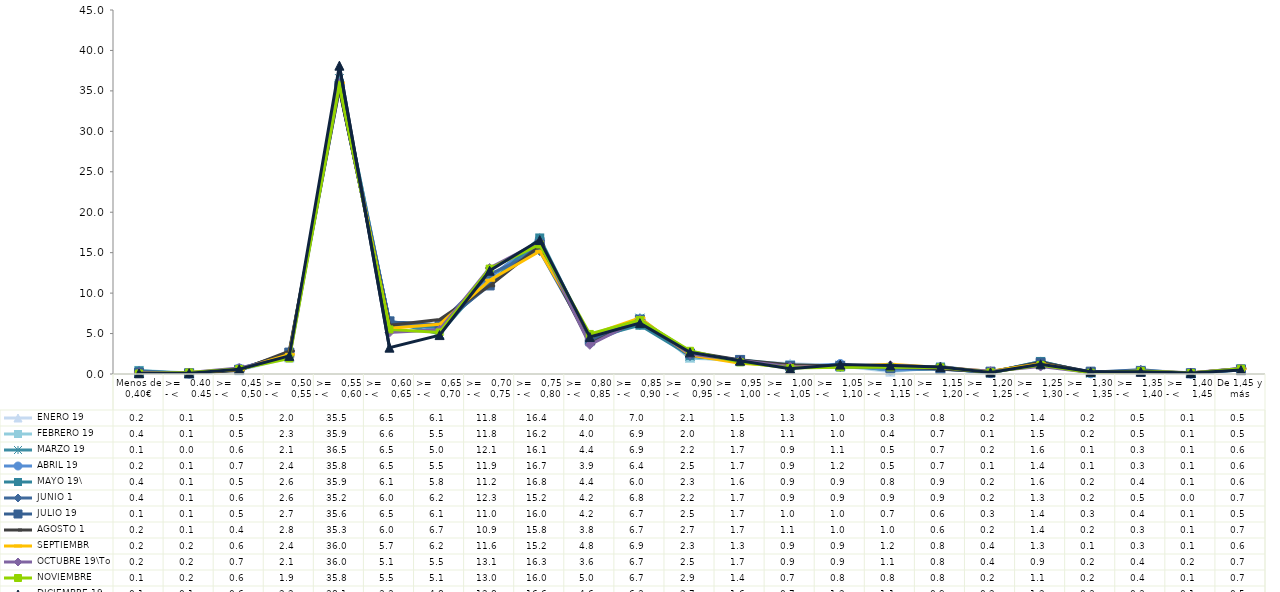
| Category |  ENERO 19 |  FEBRERO 19 |  MARZO 19 |  ABRIL 19 |  MAYO 19\ |  JUNIO 1 |  JULIO 19 |  AGOSTO 1 |  SEPTIEMBR |  OCTUBRE 19\To |  NOVIEMBRE  |  DICIEMBRE 19 |
|---|---|---|---|---|---|---|---|---|---|---|---|---|
| Menos de 0,40€ | 0.2 | 0.44 | 0.13 | 0.18 | 0.39 | 0.35 | 0.14 | 0.16 | 0.2 | 0.15 | 0.06 | 0.09 |
| >=   0.40 - <    0.45 | 0.08 | 0.12 | 0.03 | 0.06 | 0.05 | 0.07 | 0.09 | 0.11 | 0.18 | 0.18 | 0.19 | 0.1 |
| >=   0,45 - <    0,50 | 0.46 | 0.52 | 0.56 | 0.68 | 0.52 | 0.6 | 0.53 | 0.44 | 0.56 | 0.74 | 0.61 | 0.59 |
| >=   0,50 - <    0,55 | 2 | 2.28 | 2.09 | 2.36 | 2.64 | 2.57 | 2.65 | 2.84 | 2.43 | 2.07 | 1.92 | 2.24 |
| >=   0,55 - <    0,60 | 35.5 | 35.91 | 36.53 | 35.75 | 35.85 | 35.24 | 35.64 | 35.29 | 35.98 | 35.96 | 35.76 | 38.12 |
| >=   0,60 - <    0,65 | 6.48 | 6.55 | 6.45 | 6.51 | 6.08 | 6.02 | 6.5 | 6.02 | 5.65 | 5.13 | 5.51 | 3.26 |
| >=   0,65 - <   0,70 | 6.09 | 5.48 | 4.96 | 5.48 | 5.82 | 6.17 | 6.06 | 6.73 | 6.15 | 5.47 | 5.14 | 4.81 |
| >=   0,70 - <   0,75 | 11.8 | 11.8 | 12.07 | 11.94 | 11.15 | 12.34 | 10.95 | 10.9 | 11.59 | 13.1 | 13.03 | 12.77 |
| >=   0,75 - <   0,80 | 16.37 | 16.24 | 16.05 | 16.66 | 16.82 | 15.2 | 16.01 | 15.81 | 15.17 | 16.34 | 16.01 | 16.56 |
| >=   0,80 - <   0,85 | 4.02 | 4.03 | 4.37 | 3.89 | 4.39 | 4.15 | 4.17 | 3.76 | 4.8 | 3.61 | 4.95 | 4.57 |
| >=   0,85 - <   0,90 | 6.98 | 6.85 | 6.9 | 6.39 | 6.03 | 6.8 | 6.7 | 6.69 | 6.93 | 6.74 | 6.67 | 6.29 |
| >=   0,90 - <    0,95 | 2.1 | 1.96 | 2.19 | 2.54 | 2.29 | 2.23 | 2.54 | 2.74 | 2.34 | 2.48 | 2.87 | 2.68 |
| >=   0,95 - <   1,00 | 1.54 | 1.76 | 1.7 | 1.69 | 1.55 | 1.73 | 1.74 | 1.72 | 1.32 | 1.66 | 1.44 | 1.64 |
| >=   1,00 - <   1,05 | 1.31 | 1.14 | 0.93 | 0.88 | 0.85 | 0.89 | 1.01 | 1.13 | 0.93 | 0.9 | 0.73 | 0.66 |
| >=   1,05 - <    1,10 | 1.02 | 1.01 | 1.08 | 1.24 | 0.86 | 0.89 | 1 | 0.99 | 0.9 | 0.91 | 0.83 | 1.16 |
| >=   1,10 - <   1,15 | 0.29 | 0.42 | 0.48 | 0.46 | 0.78 | 0.9 | 0.73 | 1 | 1.19 | 1.09 | 0.83 | 1.05 |
| >=   1,15 - <    1,20 | 0.79 | 0.71 | 0.66 | 0.73 | 0.86 | 0.93 | 0.6 | 0.63 | 0.79 | 0.81 | 0.81 | 0.86 |
| >=   1,20 - <    1,25 | 0.2 | 0.12 | 0.19 | 0.11 | 0.21 | 0.2 | 0.29 | 0.24 | 0.35 | 0.35 | 0.21 | 0.19 |
| >=   1,25 - <    1,30 | 1.43 | 1.46 | 1.55 | 1.41 | 1.55 | 1.29 | 1.39 | 1.44 | 1.27 | 0.92 | 1.12 | 1.2 |
| >=   1,30 - <    1,35 | 0.18 | 0.18 | 0.11 | 0.09 | 0.17 | 0.22 | 0.29 | 0.24 | 0.14 | 0.2 | 0.16 | 0.27 |
| >=   1,35 - <    1,40 | 0.53 | 0.46 | 0.3 | 0.33 | 0.36 | 0.52 | 0.35 | 0.29 | 0.32 | 0.37 | 0.38 | 0.27 |
| >=   1,40 - <    1,45 | 0.08 | 0.06 | 0.07 | 0.06 | 0.11 | 0.03 | 0.09 | 0.13 | 0.14 | 0.15 | 0.12 | 0.12 |
| De 1,45 y más | 0.5 | 0.49 | 0.57 | 0.56 | 0.64 | 0.66 | 0.54 | 0.67 | 0.63 | 0.68 | 0.65 | 0.48 |